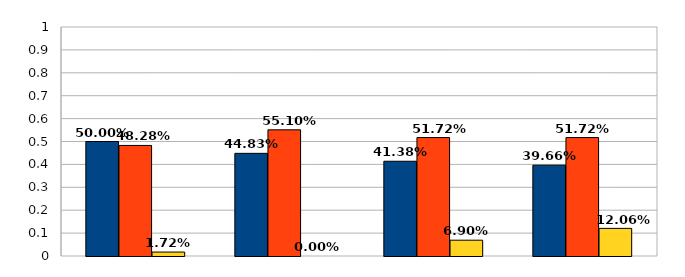
| Category | Хорошо | Удовлетворительно | Неудовлетворительно |
|---|---|---|---|
| 0 | 0.5 | 0.483 | 0.017 |
| 1 | 0.448 | 0.551 | 0 |
| 2 | 0.414 | 0.517 | 0.069 |
| 3 | 0.397 | 0.517 | 0.121 |